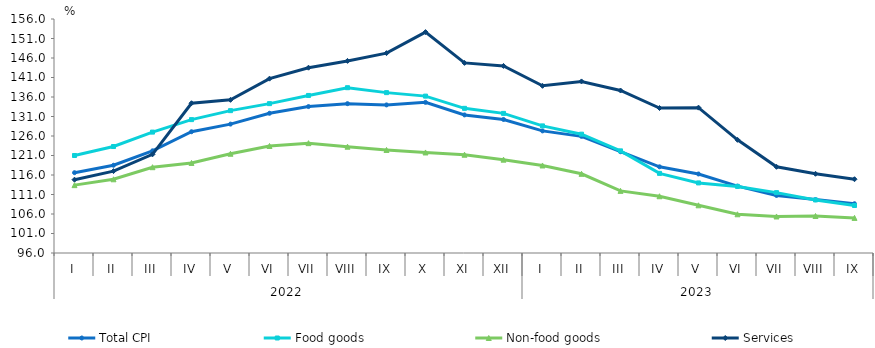
| Category | Total CPI | Food goods | Non-food goods | Services |
|---|---|---|---|---|
| 0 | 116.6 | 121 | 113.4 | 114.8 |
| 1 | 118.5 | 123.3 | 114.9 | 117 |
| 2 | 122.2 | 127 | 118 | 121.3 |
| 3 | 127.1 | 130.2 | 119.1 | 134.4 |
| 4 | 129.047 | 132.5 | 121.45 | 135.267 |
| 5 | 131.827 | 134.301 | 123.443 | 140.701 |
| 6 | 133.547 | 136.399 | 124.168 | 143.511 |
| 7 | 134.294 | 138.387 | 123.256 | 145.253 |
| 8 | 133.971 | 137.121 | 122.424 | 147.248 |
| 9 | 134.625 | 136.226 | 121.779 | 152.646 |
| 10 | 131.406 | 133.093 | 121.201 | 144.742 |
| 11 | 130.241 | 131.801 | 119.936 | 143.965 |
| 12 | 127.307 | 128.59 | 118.441 | 138.865 |
| 13 | 125.905 | 126.472 | 116.307 | 139.99 |
| 14 | 121.977 | 122.19 | 111.932 | 137.666 |
| 15 | 118.102 | 116.414 | 110.554 | 133.178 |
| 16 | 116.262 | 113.97 | 108.228 | 133.268 |
| 17 | 113.152 | 113.076 | 105.931 | 125.017 |
| 18 | 110.755 | 111.48 | 105.365 | 118.101 |
| 19 | 109.689 | 109.605 | 105.486 | 116.313 |
| 20 | 108.634 | 108.179 | 105.004 | 114.916 |